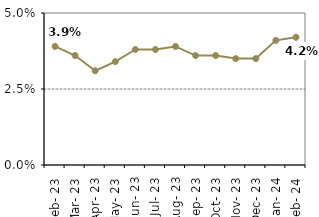
| Category | Series 0 |
|---|---|
| Feb- 23 | 0.039 |
| Mar- 23 | 0.036 |
| Apr- 23 | 0.031 |
| May- 23 | 0.034 |
| Jun- 23 | 0.038 |
| Jul- 23 | 0.038 |
| Aug- 23 | 0.039 |
| Sep- 23 | 0.036 |
| Oct- 23 | 0.036 |
| Nov- 23 | 0.035 |
| Dec- 23 | 0.035 |
| Jan- 24 | 0.041 |
| Feb- 24 | 0.042 |